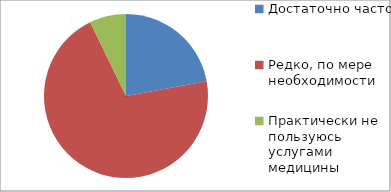
| Category | 2. Как часто Вы обращаетесь в данное лечебное учреждение? |
|---|---|
| Достаточно часто | 360 |
| Редко, по мере необходимости | 1149 |
| Практически не пользуюсь услугами медицины | 117 |